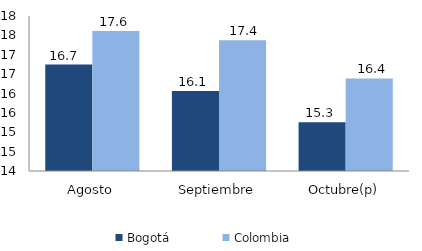
| Category | Bogotá | Colombia |
|---|---|---|
| Agosto | 16.746 | 17.616 |
| Septiembre | 16.064 | 17.371 |
| Octubre(p) | 15.26 | 16.389 |